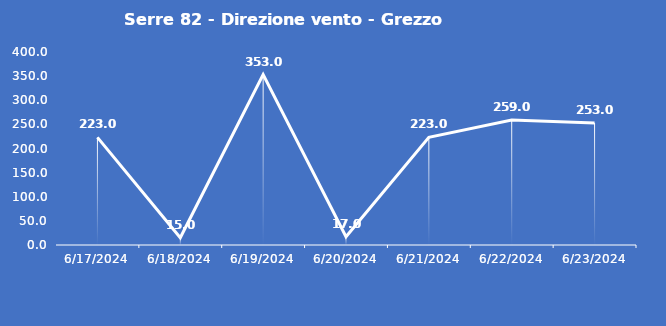
| Category | Serre 82 - Direzione vento - Grezzo (°N) |
|---|---|
| 6/17/24 | 223 |
| 6/18/24 | 15 |
| 6/19/24 | 353 |
| 6/20/24 | 17 |
| 6/21/24 | 223 |
| 6/22/24 | 259 |
| 6/23/24 | 253 |